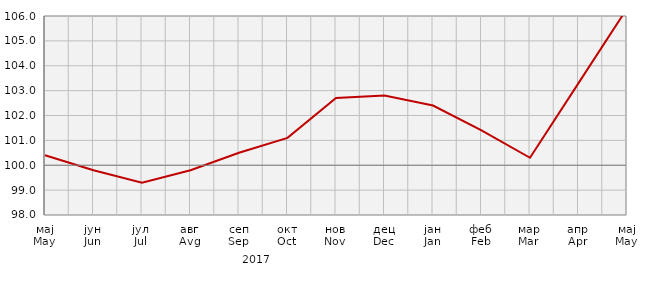
| Category | Индекси цијена произвођача
Producer price indices |
|---|---|
| мај
May | 100.4 |
| јун
Jun | 99.8 |
| јул
Jul | 99.3 |
| авг
Avg | 99.8 |
| сеп
Sep | 100.5 |
| окт
Oct | 101.1 |
| нов
Nov | 102.7 |
| дец
Dec | 102.8 |
| јан
Jan | 102.4 |
| феб
Feb | 101.4 |
| мар
Mar | 100.3 |
| апр
Apr | 103.3 |
| мај
May | 106.3 |